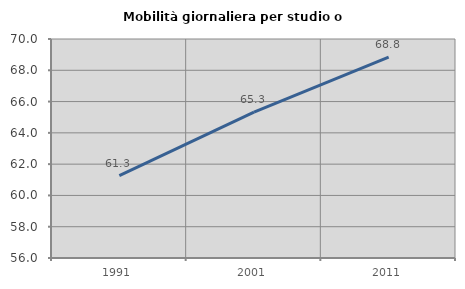
| Category | Mobilità giornaliera per studio o lavoro |
|---|---|
| 1991.0 | 61.268 |
| 2001.0 | 65.324 |
| 2011.0 | 68.844 |